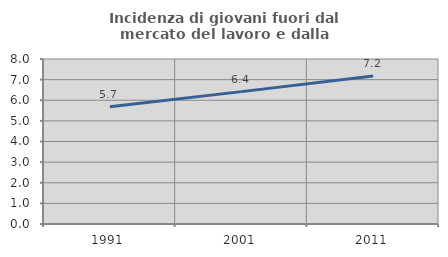
| Category | Incidenza di giovani fuori dal mercato del lavoro e dalla formazione  |
|---|---|
| 1991.0 | 5.68 |
| 2001.0 | 6.418 |
| 2011.0 | 7.171 |